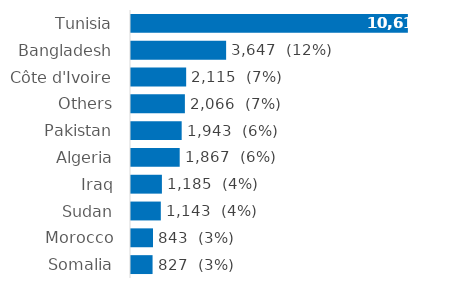
| Category | Series 0 |
|---|---|
| Tunisia | 10615 |
| Bangladesh | 3647 |
| Côte d'Ivoire | 2115 |
| Others | 2066 |
| Pakistan | 1943 |
| Algeria | 1867 |
| Iraq | 1185 |
| Sudan | 1143 |
| Morocco | 843 |
| Somalia | 827 |